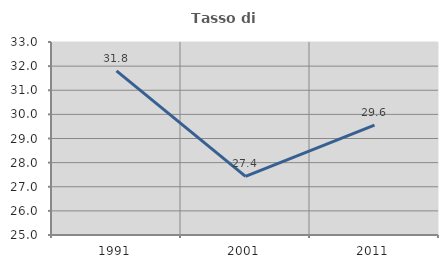
| Category | Tasso di occupazione   |
|---|---|
| 1991.0 | 31.801 |
| 2001.0 | 27.432 |
| 2011.0 | 29.552 |